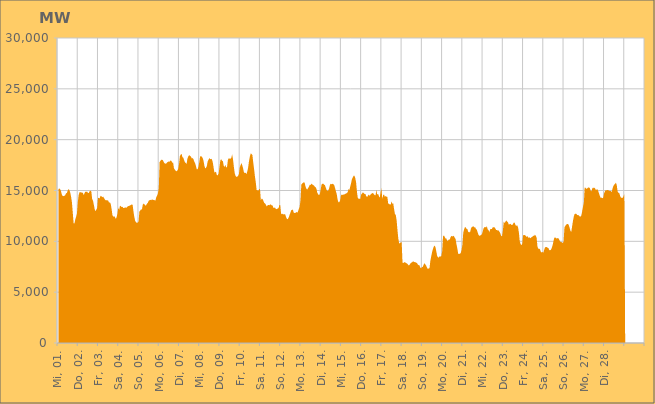
| Category | Series 0 |
|---|---|
|  Mi, 01.  | 15133.107 |
|  Mi, 01.  | 15212.404 |
|  Mi, 01.  | 15136.504 |
|  Mi, 01.  | 14954.264 |
|  Mi, 01.  | 14612.194 |
|  Mi, 01.  | 14466.693 |
|  Mi, 01.  | 14442.248 |
|  Mi, 01.  | 14474.129 |
|  Mi, 01.  | 14539.461 |
|  Mi, 01.  | 14715.91 |
|  Mi, 01.  | 14754.413 |
|  Mi, 01.  | 14995.52 |
|  Mi, 01.  | 15140.985 |
|  Mi, 01.  | 15030.469 |
|  Mi, 01.  | 14810.131 |
|  Mi, 01.  | 14393.581 |
|  Mi, 01.  | 13845.299 |
|  Do, 02.  | 12841.779 |
|  Do, 02.  | 11783.493 |
|  Do, 02.  | 11759.608 |
|  Do, 02.  | 12156.862 |
|  Do, 02.  | 12421.603 |
|  Do, 02.  | 12753.498 |
|  Do, 02.  | 13859.51 |
|  Do, 02.  | 14570.404 |
|  Do, 02.  | 14832.284 |
|  Do, 02.  | 14821.246 |
|  Do, 02.  | 14824.713 |
|  Do, 02.  | 14777.662 |
|  Do, 02.  | 14782.136 |
|  Do, 02.  | 14545.527 |
|  Do, 02.  | 14742.749 |
|  Do, 02.  | 14893.57 |
|  Do, 02.  | 14856.011 |
|  Do, 02.  | 14917.809 |
|  Do, 02.  | 14755.275 |
|  Do, 02.  | 14762.391 |
|  Do, 02.  | 14918.146 |
|  Do, 02.  | 14991.522 |
|  Do, 02.  | 14916.513 |
|  Do, 02.  | 14172.639 |
|  Fr, 03.  | 14000.413 |
|  Fr, 03.  | 13601.783 |
|  Fr, 03.  | 13150.215 |
|  Fr, 03.  | 12956.556 |
|  Fr, 03.  | 13122.318 |
|  Fr, 03.  | 13314.572 |
|  Fr, 03.  | 14287.111 |
|  Fr, 03.  | 14248.689 |
|  Fr, 03.  | 14245.494 |
|  Fr, 03.  | 14488.062 |
|  Fr, 03.  | 14423.027 |
|  Fr, 03.  | 14335.016 |
|  Fr, 03.  | 14402.037 |
|  Fr, 03.  | 14269.799 |
|  Fr, 03.  | 14132.893 |
|  Fr, 03.  | 14050.432 |
|  Fr, 03.  | 14044.313 |
|  Fr, 03.  | 14038.18 |
|  Fr, 03.  | 14006.121 |
|  Fr, 03.  | 13815.292 |
|  Fr, 03.  | 13831.324 |
|  Fr, 03.  | 13685.97 |
|  Fr, 03.  | 13204.246 |
|  Fr, 03.  | 12601.399 |
|  Sa, 04.  | 12417.162 |
|  Sa, 04.  | 12492.021 |
|  Sa, 04.  | 12381.832 |
|  Sa, 04.  | 12205.198 |
|  Sa, 04.  | 12377.207 |
|  Sa, 04.  | 12719.056 |
|  Sa, 04.  | 13311.458 |
|  Sa, 04.  | 13103.094 |
|  Sa, 04.  | 13517.375 |
|  Sa, 04.  | 13448.981 |
|  Sa, 04.  | 13361.188 |
|  Sa, 04.  | 13397.913 |
|  Sa, 04.  | 13268.282 |
|  Sa, 04.  | 13303.337 |
|  Sa, 04.  | 13304.578 |
|  Sa, 04.  | 13343.729 |
|  Sa, 04.  | 13310.405 |
|  Sa, 04.  | 13435.638 |
|  Sa, 04.  | 13476.19 |
|  Sa, 04.  | 13488.824 |
|  Sa, 04.  | 13553.353 |
|  Sa, 04.  | 13566.321 |
|  Sa, 04.  | 13650.503 |
|  Sa, 04.  | 13579.51 |
|  So, 05.  | 12918.914 |
|  So, 05.  | 12400.15 |
|  So, 05.  | 12013.75 |
|  So, 05.  | 11876.47 |
|  So, 05.  | 11825.453 |
|  So, 05.  | 11842.868 |
|  So, 05.  | 11940.18 |
|  So, 05.  | 12926.453 |
|  So, 05.  | 13029.839 |
|  So, 05.  | 13153.216 |
|  So, 05.  | 13119.375 |
|  So, 05.  | 13599.47 |
|  So, 05.  | 13714.152 |
|  So, 05.  | 13638.932 |
|  So, 05.  | 13510.589 |
|  So, 05.  | 13555.155 |
|  So, 05.  | 13695.863 |
|  So, 05.  | 13788.057 |
|  So, 05.  | 13991.875 |
|  So, 05.  | 14035.711 |
|  So, 05.  | 14083.971 |
|  So, 05.  | 14045.039 |
|  So, 05.  | 14127.741 |
|  So, 05.  | 14089.871 |
|  Mo, 06.  | 14059.677 |
|  Mo, 06.  | 14046.218 |
|  Mo, 06.  | 14010.115 |
|  Mo, 06.  | 14334.697 |
|  Mo, 06.  | 14489.487 |
|  Mo, 06.  | 14719.747 |
|  Mo, 06.  | 15234.845 |
|  Mo, 06.  | 17799.534 |
|  Mo, 06.  | 17922.507 |
|  Mo, 06.  | 18021.67 |
|  Mo, 06.  | 18027.102 |
|  Mo, 06.  | 17966.471 |
|  Mo, 06.  | 17772.151 |
|  Mo, 06.  | 17673.169 |
|  Mo, 06.  | 17629.582 |
|  Mo, 06.  | 17665.834 |
|  Mo, 06.  | 17780.407 |
|  Mo, 06.  | 17797.554 |
|  Mo, 06.  | 17873.85 |
|  Mo, 06.  | 17830.009 |
|  Mo, 06.  | 17962.972 |
|  Mo, 06.  | 17899.952 |
|  Mo, 06.  | 17741.495 |
|  Mo, 06.  | 17735.026 |
|  Di, 07.  | 17189.16 |
|  Di, 07.  | 17052.819 |
|  Di, 07.  | 16944.889 |
|  Di, 07.  | 16876.964 |
|  Di, 07.  | 16953.083 |
|  Di, 07.  | 17123.298 |
|  Di, 07.  | 17582.199 |
|  Di, 07.  | 18365.633 |
|  Di, 07.  | 18528.757 |
|  Di, 07.  | 18616.639 |
|  Di, 07.  | 18293.531 |
|  Di, 07.  | 18225.556 |
|  Di, 07.  | 17987.579 |
|  Di, 07.  | 17779.72 |
|  Di, 07.  | 17706.097 |
|  Di, 07.  | 17618.447 |
|  Di, 07.  | 18151.137 |
|  Di, 07.  | 18350.746 |
|  Di, 07.  | 18480.045 |
|  Di, 07.  | 18401.582 |
|  Di, 07.  | 18351.13 |
|  Di, 07.  | 18170.811 |
|  Di, 07.  | 18190.629 |
|  Di, 07.  | 18089.62 |
|  Mi, 08.  | 17866.903 |
|  Mi, 08.  | 17701.655 |
|  Mi, 08.  | 17425.151 |
|  Mi, 08.  | 17097.466 |
|  Mi, 08.  | 17092.535 |
|  Mi, 08.  | 17324.031 |
|  Mi, 08.  | 17770.928 |
|  Mi, 08.  | 18344.374 |
|  Mi, 08.  | 18371.785 |
|  Mi, 08.  | 18327.262 |
|  Mi, 08.  | 18204.396 |
|  Mi, 08.  | 17941.752 |
|  Mi, 08.  | 17460.065 |
|  Mi, 08.  | 17186.17 |
|  Mi, 08.  | 17222.86 |
|  Mi, 08.  | 17427.86 |
|  Mi, 08.  | 17864.71 |
|  Mi, 08.  | 18046.807 |
|  Mi, 08.  | 18191.156 |
|  Mi, 08.  | 18076.241 |
|  Mi, 08.  | 18118.864 |
|  Mi, 08.  | 18066.267 |
|  Mi, 08.  | 17770.253 |
|  Mi, 08.  | 17260.158 |
|  Do, 09.  | 16741.287 |
|  Do, 09.  | 16841.831 |
|  Do, 09.  | 16782.423 |
|  Do, 09.  | 16484.638 |
|  Do, 09.  | 16508.739 |
|  Do, 09.  | 16686.443 |
|  Do, 09.  | 17353.837 |
|  Do, 09.  | 17957.233 |
|  Do, 09.  | 18094.734 |
|  Do, 09.  | 17928.401 |
|  Do, 09.  | 17887.634 |
|  Do, 09.  | 17437.661 |
|  Do, 09.  | 17309.532 |
|  Do, 09.  | 17529.012 |
|  Do, 09.  | 17238.703 |
|  Do, 09.  | 17352.158 |
|  Do, 09.  | 18023.791 |
|  Do, 09.  | 18185.758 |
|  Do, 09.  | 18133.35 |
|  Do, 09.  | 18131.294 |
|  Do, 09.  | 18219.815 |
|  Do, 09.  | 18548.312 |
|  Do, 09.  | 18068.529 |
|  Do, 09.  | 17344.975 |
|  Fr, 10.  | 16720.783 |
|  Fr, 10.  | 16443.186 |
|  Fr, 10.  | 16337.218 |
|  Fr, 10.  | 16362.623 |
|  Fr, 10.  | 16432.105 |
|  Fr, 10.  | 16617.733 |
|  Fr, 10.  | 17271.276 |
|  Fr, 10.  | 17491.214 |
|  Fr, 10.  | 17700.101 |
|  Fr, 10.  | 17474.032 |
|  Fr, 10.  | 17163.616 |
|  Fr, 10.  | 16787.994 |
|  Fr, 10.  | 16718.698 |
|  Fr, 10.  | 16752.276 |
|  Fr, 10.  | 16601.174 |
|  Fr, 10.  | 16893.136 |
|  Fr, 10.  | 17289.157 |
|  Fr, 10.  | 17903.857 |
|  Fr, 10.  | 18341.589 |
|  Fr, 10.  | 18642.112 |
|  Fr, 10.  | 18595.17 |
|  Fr, 10.  | 18478.358 |
|  Fr, 10.  | 17749.538 |
|  Fr, 10.  | 17110.683 |
|  Sa, 11.  | 16385.005 |
|  Sa, 11.  | 15818.016 |
|  Sa, 11.  | 15055.62 |
|  Sa, 11.  | 15019.403 |
|  Sa, 11.  | 14984.96 |
|  Sa, 11.  | 15119.794 |
|  Sa, 11.  | 15162.839 |
|  Sa, 11.  | 14053.743 |
|  Sa, 11.  | 14199.875 |
|  Sa, 11.  | 14165.299 |
|  Sa, 11.  | 13988.148 |
|  Sa, 11.  | 13777.658 |
|  Sa, 11.  | 13731.144 |
|  Sa, 11.  | 13594.335 |
|  Sa, 11.  | 13433.984 |
|  Sa, 11.  | 13539.388 |
|  Sa, 11.  | 13588.271 |
|  Sa, 11.  | 13543.353 |
|  Sa, 11.  | 13632.325 |
|  Sa, 11.  | 13626.868 |
|  Sa, 11.  | 13518.795 |
|  Sa, 11.  | 13514.283 |
|  Sa, 11.  | 13275.689 |
|  Sa, 11.  | 13319.543 |
|  So, 12.  | 13298.765 |
|  So, 12.  | 13162.99 |
|  So, 12.  | 13175.822 |
|  So, 12.  | 13231.398 |
|  So, 12.  | 13261.088 |
|  So, 12.  | 13574.611 |
|  So, 12.  | 13581.249 |
|  So, 12.  | 12739.242 |
|  So, 12.  | 12656.74 |
|  So, 12.  | 12722.401 |
|  So, 12.  | 12633.557 |
|  So, 12.  | 12668.983 |
|  So, 12.  | 12636.318 |
|  So, 12.  | 12358.242 |
|  So, 12.  | 12201.894 |
|  So, 12.  | 12178.143 |
|  So, 12.  | 12343.241 |
|  So, 12.  | 12578.285 |
|  So, 12.  | 12807.137 |
|  So, 12.  | 13059.867 |
|  So, 12.  | 13084.871 |
|  So, 12.  | 13126.094 |
|  So, 12.  | 12813.397 |
|  So, 12.  | 12785.799 |
|  Mo, 13.  | 12795.556 |
|  Mo, 13.  | 12904.017 |
|  Mo, 13.  | 12797.651 |
|  Mo, 13.  | 12926.793 |
|  Mo, 13.  | 13173.321 |
|  Mo, 13.  | 13390.929 |
|  Mo, 13.  | 14009.684 |
|  Mo, 13.  | 15575.417 |
|  Mo, 13.  | 15689.586 |
|  Mo, 13.  | 15740.431 |
|  Mo, 13.  | 15818.061 |
|  Mo, 13.  | 15750.267 |
|  Mo, 13.  | 15383.158 |
|  Mo, 13.  | 15176.707 |
|  Mo, 13.  | 15093.348 |
|  Mo, 13.  | 15236.351 |
|  Mo, 13.  | 15368.94 |
|  Mo, 13.  | 15565.721 |
|  Mo, 13.  | 15543.079 |
|  Mo, 13.  | 15671.357 |
|  Mo, 13.  | 15597.581 |
|  Mo, 13.  | 15534.692 |
|  Mo, 13.  | 15494.982 |
|  Mo, 13.  | 15369.663 |
|  Di, 14.  | 15329.341 |
|  Di, 14.  | 15150.784 |
|  Di, 14.  | 14763.815 |
|  Di, 14.  | 14633.746 |
|  Di, 14.  | 14533.534 |
|  Di, 14.  | 14674.555 |
|  Di, 14.  | 15095.796 |
|  Di, 14.  | 15591.634 |
|  Di, 14.  | 15666.803 |
|  Di, 14.  | 15677.496 |
|  Di, 14.  | 15574.324 |
|  Di, 14.  | 15531.518 |
|  Di, 14.  | 15289.96 |
|  Di, 14.  | 15054.051 |
|  Di, 14.  | 14953.628 |
|  Di, 14.  | 15004.909 |
|  Di, 14.  | 15218.676 |
|  Di, 14.  | 15571.238 |
|  Di, 14.  | 15668.935 |
|  Di, 14.  | 15607.329 |
|  Di, 14.  | 15684.176 |
|  Di, 14.  | 15605.313 |
|  Di, 14.  | 15531.19 |
|  Di, 14.  | 15247.176 |
|  Mi, 15.  | 14921.591 |
|  Mi, 15.  | 14645.188 |
|  Mi, 15.  | 14121.598 |
|  Mi, 15.  | 13851.636 |
|  Mi, 15.  | 13833.336 |
|  Mi, 15.  | 14021.777 |
|  Mi, 15.  | 14509.7 |
|  Mi, 15.  | 14604.44 |
|  Mi, 15.  | 14555.652 |
|  Mi, 15.  | 14605.556 |
|  Mi, 15.  | 14613.878 |
|  Mi, 15.  | 14683.657 |
|  Mi, 15.  | 14689.05 |
|  Mi, 15.  | 14761.121 |
|  Mi, 15.  | 14830.777 |
|  Mi, 15.  | 15150.918 |
|  Mi, 15.  | 15046.125 |
|  Mi, 15.  | 15373.44 |
|  Mi, 15.  | 15721.55 |
|  Mi, 15.  | 16105.788 |
|  Mi, 15.  | 16272.084 |
|  Mi, 15.  | 16439.719 |
|  Mi, 15.  | 16461.59 |
|  Mi, 15.  | 16217.784 |
|  Do, 16.  | 15761.324 |
|  Do, 16.  | 14824.263 |
|  Do, 16.  | 14265.929 |
|  Do, 16.  | 14186.934 |
|  Do, 16.  | 14196.434 |
|  Do, 16.  | 14185.699 |
|  Do, 16.  | 14627.904 |
|  Do, 16.  | 14695.187 |
|  Do, 16.  | 14821.437 |
|  Do, 16.  | 14732.083 |
|  Do, 16.  | 14665.288 |
|  Do, 16.  | 14649.24 |
|  Do, 16.  | 14435.249 |
|  Do, 16.  | 14353.724 |
|  Do, 16.  | 14487.199 |
|  Do, 16.  | 14604.489 |
|  Do, 16.  | 14473.394 |
|  Do, 16.  | 14590.314 |
|  Do, 16.  | 14683.53 |
|  Do, 16.  | 14727.168 |
|  Do, 16.  | 14760.416 |
|  Do, 16.  | 14631.792 |
|  Do, 16.  | 14547.312 |
|  Do, 16.  | 14523.085 |
|  Fr, 17.  | 15048.245 |
|  Fr, 17.  | 14600.345 |
|  Fr, 17.  | 14669.431 |
|  Fr, 17.  | 14454.114 |
|  Fr, 17.  | 14292.013 |
|  Fr, 17.  | 14809.095 |
|  Fr, 17.  | 15239.6 |
|  Fr, 17.  | 14173.525 |
|  Fr, 17.  | 14536.179 |
|  Fr, 17.  | 14626.762 |
|  Fr, 17.  | 14390.122 |
|  Fr, 17.  | 14448.692 |
|  Fr, 17.  | 14397.207 |
|  Fr, 17.  | 14367.612 |
|  Fr, 17.  | 13729.8 |
|  Fr, 17.  | 13647.182 |
|  Fr, 17.  | 13636.141 |
|  Fr, 17.  | 13620.645 |
|  Fr, 17.  | 13925.755 |
|  Fr, 17.  | 13686.174 |
|  Fr, 17.  | 13747.283 |
|  Fr, 17.  | 13166.154 |
|  Fr, 17.  | 12688.179 |
|  Fr, 17.  | 12606.332 |
|  Sa, 18.  | 12057.723 |
|  Sa, 18.  | 11109.876 |
|  Sa, 18.  | 10275.188 |
|  Sa, 18.  | 9810.264 |
|  Sa, 18.  | 9823.463 |
|  Sa, 18.  | 9900.696 |
|  Sa, 18.  | 9896.512 |
|  Sa, 18.  | 7890.553 |
|  Sa, 18.  | 7871.736 |
|  Sa, 18.  | 7937.011 |
|  Sa, 18.  | 7944.958 |
|  Sa, 18.  | 7870.422 |
|  Sa, 18.  | 7837.529 |
|  Sa, 18.  | 7765.857 |
|  Sa, 18.  | 7642.121 |
|  Sa, 18.  | 7654.06 |
|  Sa, 18.  | 7772.151 |
|  Sa, 18.  | 7884.724 |
|  Sa, 18.  | 7923.509 |
|  Sa, 18.  | 7998.065 |
|  Sa, 18.  | 8022.726 |
|  Sa, 18.  | 7946.016 |
|  Sa, 18.  | 7977.992 |
|  Sa, 18.  | 7885.848 |
|  So, 19.  | 7882.41 |
|  So, 19.  | 7732.328 |
|  So, 19.  | 7661.316 |
|  So, 19.  | 7653.602 |
|  So, 19.  | 7422.099 |
|  So, 19.  | 7352.922 |
|  So, 19.  | 7457.307 |
|  So, 19.  | 7487.953 |
|  So, 19.  | 7702.282 |
|  So, 19.  | 7848.274 |
|  So, 19.  | 7735.522 |
|  So, 19.  | 7617.634 |
|  So, 19.  | 7414.633 |
|  So, 19.  | 7285.242 |
|  So, 19.  | 7335.448 |
|  So, 19.  | 7352.04 |
|  So, 19.  | 8085.611 |
|  So, 19.  | 8508.658 |
|  So, 19.  | 8918.784 |
|  So, 19.  | 9236.739 |
|  So, 19.  | 9463.069 |
|  So, 19.  | 9582.113 |
|  So, 19.  | 9439.204 |
|  So, 19.  | 9041.523 |
|  Mo, 20.  | 8593.104 |
|  Mo, 20.  | 8434.771 |
|  Mo, 20.  | 8393.052 |
|  Mo, 20.  | 8528.006 |
|  Mo, 20.  | 8502.832 |
|  Mo, 20.  | 8542.536 |
|  Mo, 20.  | 9026.475 |
|  Mo, 20.  | 10480.249 |
|  Mo, 20.  | 10588.877 |
|  Mo, 20.  | 10432.3 |
|  Mo, 20.  | 10276.352 |
|  Mo, 20.  | 10266.977 |
|  Mo, 20.  | 10052.395 |
|  Mo, 20.  | 10083.231 |
|  Mo, 20.  | 10181.864 |
|  Mo, 20.  | 10181.918 |
|  Mo, 20.  | 10421.279 |
|  Mo, 20.  | 10534.348 |
|  Mo, 20.  | 10471.8 |
|  Mo, 20.  | 10547.536 |
|  Mo, 20.  | 10495.687 |
|  Mo, 20.  | 10348.074 |
|  Mo, 20.  | 10197.264 |
|  Mo, 20.  | 9696.505 |
|  Di, 21.  | 9281.069 |
|  Di, 21.  | 8783.436 |
|  Di, 21.  | 8737.855 |
|  Di, 21.  | 8801.517 |
|  Di, 21.  | 8844.519 |
|  Di, 21.  | 9144.753 |
|  Di, 21.  | 9660.101 |
|  Di, 21.  | 10835.576 |
|  Di, 21.  | 11169.04 |
|  Di, 21.  | 11394.743 |
|  Di, 21.  | 11377.335 |
|  Di, 21.  | 11224.008 |
|  Di, 21.  | 11185.519 |
|  Di, 21.  | 10894.138 |
|  Di, 21.  | 10935.86 |
|  Di, 21.  | 10847.359 |
|  Di, 21.  | 11218.494 |
|  Di, 21.  | 11388.915 |
|  Di, 21.  | 11446.922 |
|  Di, 21.  | 11485.611 |
|  Di, 21.  | 11363.049 |
|  Di, 21.  | 11400.493 |
|  Di, 21.  | 11240.369 |
|  Di, 21.  | 11146.376 |
|  Mi, 22.  | 10908.271 |
|  Mi, 22.  | 10654.231 |
|  Mi, 22.  | 10539.34 |
|  Mi, 22.  | 10577.249 |
|  Mi, 22.  | 10609.464 |
|  Mi, 22.  | 10689.747 |
|  Mi, 22.  | 10926.194 |
|  Mi, 22.  | 11262.75 |
|  Mi, 22.  | 11377.487 |
|  Mi, 22.  | 11420.499 |
|  Mi, 22.  | 11336.422 |
|  Mi, 22.  | 11498.761 |
|  Mi, 22.  | 11166.658 |
|  Mi, 22.  | 11101.444 |
|  Mi, 22.  | 10895.368 |
|  Mi, 22.  | 11199.697 |
|  Mi, 22.  | 11204.03 |
|  Mi, 22.  | 11223.028 |
|  Mi, 22.  | 11398.098 |
|  Mi, 22.  | 11379.142 |
|  Mi, 22.  | 11393.978 |
|  Mi, 22.  | 11268.631 |
|  Mi, 22.  | 11123.056 |
|  Mi, 22.  | 11122.793 |
|  Do, 23.  | 11048.888 |
|  Do, 23.  | 11068.219 |
|  Do, 23.  | 10928.287 |
|  Do, 23.  | 10787.318 |
|  Do, 23.  | 10536.534 |
|  Do, 23.  | 10491.91 |
|  Do, 23.  | 11048.909 |
|  Do, 23.  | 11960.922 |
|  Do, 23.  | 11795.382 |
|  Do, 23.  | 11930.212 |
|  Do, 23.  | 12049.197 |
|  Do, 23.  | 11964.238 |
|  Do, 23.  | 11877.247 |
|  Do, 23.  | 11646.252 |
|  Do, 23.  | 11687.067 |
|  Do, 23.  | 11734.68 |
|  Do, 23.  | 11625.526 |
|  Do, 23.  | 11593.246 |
|  Do, 23.  | 11697.535 |
|  Do, 23.  | 11856.833 |
|  Do, 23.  | 11823.484 |
|  Do, 23.  | 11585.188 |
|  Do, 23.  | 11528.026 |
|  Do, 23.  | 11581.515 |
|  Fr, 24.  | 11365.169 |
|  Fr, 24.  | 10857.075 |
|  Fr, 24.  | 9997.207 |
|  Fr, 24.  | 9734.961 |
|  Fr, 24.  | 9622.935 |
|  Fr, 24.  | 9756.884 |
|  Fr, 24.  | 10617.814 |
|  Fr, 24.  | 10588.475 |
|  Fr, 24.  | 10637.159 |
|  Fr, 24.  | 10539.805 |
|  Fr, 24.  | 10443.897 |
|  Fr, 24.  | 10520.425 |
|  Fr, 24.  | 10360.709 |
|  Fr, 24.  | 10368.765 |
|  Fr, 24.  | 10373.387 |
|  Fr, 24.  | 10303.066 |
|  Fr, 24.  | 10425.807 |
|  Fr, 24.  | 10451.878 |
|  Fr, 24.  | 10540.813 |
|  Fr, 24.  | 10550.447 |
|  Fr, 24.  | 10643.373 |
|  Fr, 24.  | 10560.022 |
|  Fr, 24.  | 10348.426 |
|  Fr, 24.  | 9484.199 |
|  Sa, 25.  | 9269.695 |
|  Sa, 25.  | 9282.692 |
|  Sa, 25.  | 9210.127 |
|  Sa, 25.  | 8970.817 |
|  Sa, 25.  | 8903.965 |
|  Sa, 25.  | 8954.369 |
|  Sa, 25.  | 8896.338 |
|  Sa, 25.  | 9187.898 |
|  Sa, 25.  | 9406.038 |
|  Sa, 25.  | 9437.935 |
|  Sa, 25.  | 9438.797 |
|  Sa, 25.  | 9365.575 |
|  Sa, 25.  | 9330.6 |
|  Sa, 25.  | 9137.374 |
|  Sa, 25.  | 9127.121 |
|  Sa, 25.  | 9180.062 |
|  Sa, 25.  | 9361.991 |
|  Sa, 25.  | 9636.631 |
|  Sa, 25.  | 10042.305 |
|  Sa, 25.  | 10351.437 |
|  Sa, 25.  | 10376.55 |
|  Sa, 25.  | 10329.741 |
|  Sa, 25.  | 10250.204 |
|  Sa, 25.  | 10333.347 |
|  So, 26.  | 10293.549 |
|  So, 26.  | 10130.342 |
|  So, 26.  | 9963.044 |
|  So, 26.  | 9932.697 |
|  So, 26.  | 9902.412 |
|  So, 26.  | 9815.406 |
|  So, 26.  | 9977.58 |
|  So, 26.  | 11378.118 |
|  So, 26.  | 11518.802 |
|  So, 26.  | 11641.356 |
|  So, 26.  | 11694.505 |
|  So, 26.  | 11718.466 |
|  So, 26.  | 11620.335 |
|  So, 26.  | 11372.078 |
|  So, 26.  | 11080.128 |
|  So, 26.  | 10892.82 |
|  So, 26.  | 11427.442 |
|  So, 26.  | 11964.301 |
|  So, 26.  | 12405.857 |
|  So, 26.  | 12688.889 |
|  So, 26.  | 12708.031 |
|  So, 26.  | 12714.585 |
|  So, 26.  | 12597.607 |
|  So, 26.  | 12575.105 |
|  Mo, 27.  | 12568.741 |
|  Mo, 27.  | 12440.065 |
|  Mo, 27.  | 12429.658 |
|  Mo, 27.  | 12531.353 |
|  Mo, 27.  | 12962.214 |
|  Mo, 27.  | 13407.489 |
|  Mo, 27.  | 13793.049 |
|  Mo, 27.  | 15318.824 |
|  Mo, 27.  | 15259.469 |
|  Mo, 27.  | 15152.312 |
|  Mo, 27.  | 15213.805 |
|  Mo, 27.  | 15289.768 |
|  Mo, 27.  | 15287.526 |
|  Mo, 27.  | 15256.315 |
|  Mo, 27.  | 14997.544 |
|  Mo, 27.  | 14912.658 |
|  Mo, 27.  | 15210.269 |
|  Mo, 27.  | 15285.81 |
|  Mo, 27.  | 15204.238 |
|  Mo, 27.  | 15287.384 |
|  Mo, 27.  | 15070.223 |
|  Mo, 27.  | 15083.244 |
|  Mo, 27.  | 15120.798 |
|  Mo, 27.  | 14952.622 |
|  Di, 28.  | 14719.973 |
|  Di, 28.  | 14452.91 |
|  Di, 28.  | 14267.485 |
|  Di, 28.  | 14306.295 |
|  Di, 28.  | 14235.209 |
|  Di, 28.  | 14301.873 |
|  Di, 28.  | 14709.184 |
|  Di, 28.  | 14926.409 |
|  Di, 28.  | 15039.406 |
|  Di, 28.  | 15021.004 |
|  Di, 28.  | 15049.81 |
|  Di, 28.  | 15030.611 |
|  Di, 28.  | 14995.165 |
|  Di, 28.  | 14937.885 |
|  Di, 28.  | 14952.044 |
|  Di, 28.  | 14836.545 |
|  Di, 28.  | 15197.581 |
|  Di, 28.  | 15445.282 |
|  Di, 28.  | 15571.874 |
|  Di, 28.  | 15648.139 |
|  Di, 28.  | 15777.01 |
|  Di, 28.  | 15536.002 |
|  Di, 28.  | 14915.487 |
|  Di, 28.  | 14780.738 |
|  Mi, 01.  | 14737.93 |
|  Mi, 01.  | 14469.035 |
|  Mi, 01.  | 14292.475 |
|  Mi, 01.  | 14291.649 |
|  Mi, 01.  | 14273.146 |
|  Mi, 01.  | 14444.971 |
|    | 14643.951 |
|    | 0 |
|    | 0 |
|    | 0 |
|    | 0 |
|    | 0 |
|    | 0 |
|    | 0 |
|    | 0 |
|    | 0 |
|    | 0 |
|    | 0 |
|    | 0 |
|    | 0 |
|    | 0 |
|    | 0 |
|    | 0 |
|    | 0 |
|    | 0 |
|    | 0 |
|    | 0 |
|    | 0 |
|    | 0 |
|    | 0 |
|    | 0 |